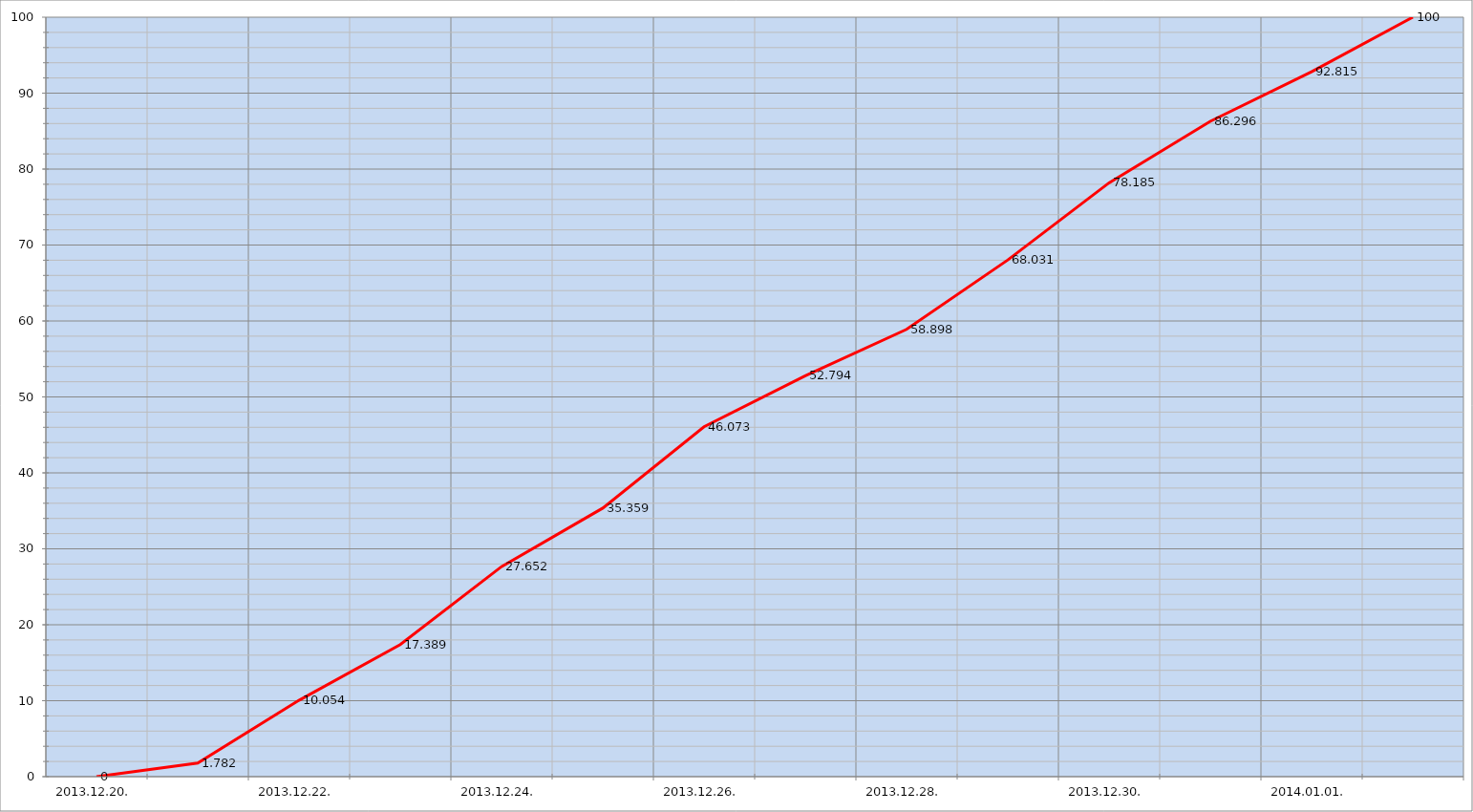
| Category | Szerver 6 |
|---|---|
| 2013-12-20 | 0 |
| 2013-12-21 | 1.782 |
| 2013-12-22 | 10.054 |
| 2013-12-23 | 17.389 |
| 2013-12-24 | 27.652 |
| 2013-12-25 | 35.359 |
| 2013-12-26 | 46.073 |
| 2013-12-27 | 52.794 |
| 2013-12-28 | 58.898 |
| 2013-12-29 | 68.031 |
| 2013-12-30 | 78.185 |
| 2013-12-31 | 86.296 |
| 2014-01-01 | 92.815 |
| 2014-01-02 | 100 |